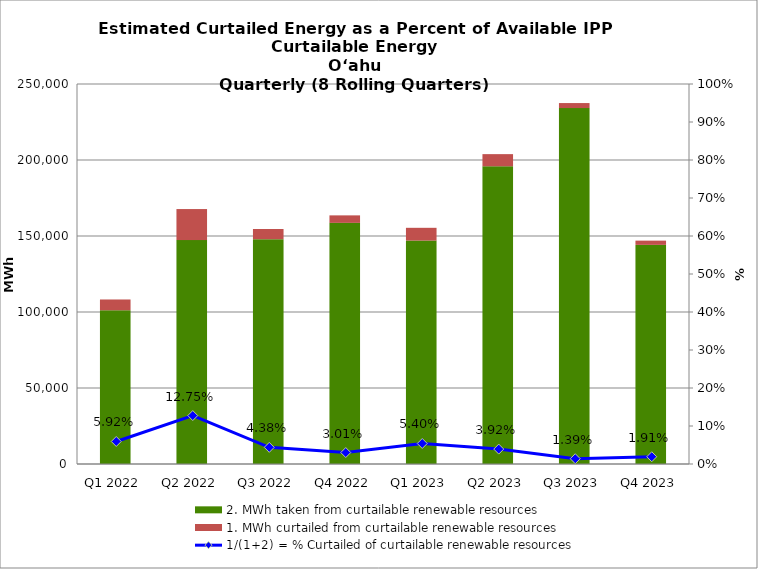
| Category | 2. MWh taken from curtailable renewable resources | 1. MWh curtailed from curtailable renewable resources |
|---|---|---|
| Q1 2022 | 101147.478 | 7090.843 |
| Q2 2022 | 147323.855 | 20405.144 |
| Q3 2022 | 147901.422 | 6694.011 |
| Q4 2022 | 158642.285 | 4928.57 |
| Q1 2023 | 146999.657 | 8388.439 |
| Q2 2023 | 195866.687 | 7994.744 |
| Q3 2023 | 234162.881 | 3300.369 |
| Q4 2023 | 144147.333 | 2806.969 |